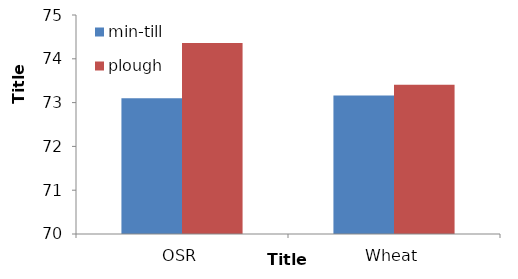
| Category | min-till | plough |
|---|---|---|
| OSR | 73.1 | 74.36 |
| Wheat | 73.16 | 73.41 |